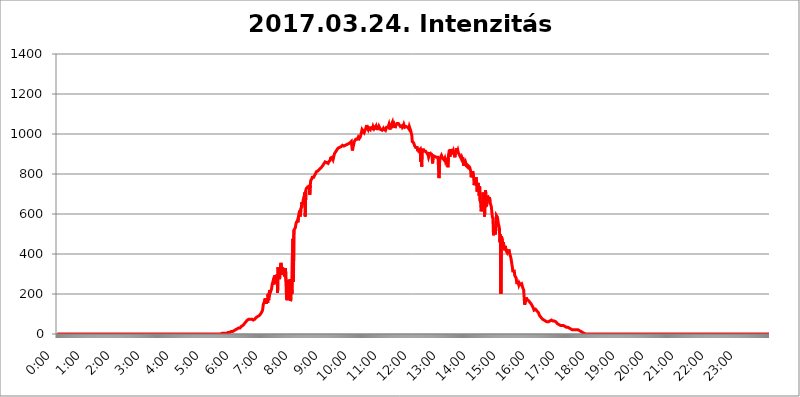
| Category | 2017.03.24. Intenzitás [W/m^2] |
|---|---|
| 0.0 | 0 |
| 0.0006944444444444445 | 0 |
| 0.001388888888888889 | 0 |
| 0.0020833333333333333 | 0 |
| 0.002777777777777778 | 0 |
| 0.003472222222222222 | 0 |
| 0.004166666666666667 | 0 |
| 0.004861111111111111 | 0 |
| 0.005555555555555556 | 0 |
| 0.0062499999999999995 | 0 |
| 0.006944444444444444 | 0 |
| 0.007638888888888889 | 0 |
| 0.008333333333333333 | 0 |
| 0.009027777777777779 | 0 |
| 0.009722222222222222 | 0 |
| 0.010416666666666666 | 0 |
| 0.011111111111111112 | 0 |
| 0.011805555555555555 | 0 |
| 0.012499999999999999 | 0 |
| 0.013194444444444444 | 0 |
| 0.013888888888888888 | 0 |
| 0.014583333333333332 | 0 |
| 0.015277777777777777 | 0 |
| 0.015972222222222224 | 0 |
| 0.016666666666666666 | 0 |
| 0.017361111111111112 | 0 |
| 0.018055555555555557 | 0 |
| 0.01875 | 0 |
| 0.019444444444444445 | 0 |
| 0.02013888888888889 | 0 |
| 0.020833333333333332 | 0 |
| 0.02152777777777778 | 0 |
| 0.022222222222222223 | 0 |
| 0.02291666666666667 | 0 |
| 0.02361111111111111 | 0 |
| 0.024305555555555556 | 0 |
| 0.024999999999999998 | 0 |
| 0.025694444444444447 | 0 |
| 0.02638888888888889 | 0 |
| 0.027083333333333334 | 0 |
| 0.027777777777777776 | 0 |
| 0.02847222222222222 | 0 |
| 0.029166666666666664 | 0 |
| 0.029861111111111113 | 0 |
| 0.030555555555555555 | 0 |
| 0.03125 | 0 |
| 0.03194444444444445 | 0 |
| 0.03263888888888889 | 0 |
| 0.03333333333333333 | 0 |
| 0.034027777777777775 | 0 |
| 0.034722222222222224 | 0 |
| 0.035416666666666666 | 0 |
| 0.036111111111111115 | 0 |
| 0.03680555555555556 | 0 |
| 0.0375 | 0 |
| 0.03819444444444444 | 0 |
| 0.03888888888888889 | 0 |
| 0.03958333333333333 | 0 |
| 0.04027777777777778 | 0 |
| 0.04097222222222222 | 0 |
| 0.041666666666666664 | 0 |
| 0.042361111111111106 | 0 |
| 0.04305555555555556 | 0 |
| 0.043750000000000004 | 0 |
| 0.044444444444444446 | 0 |
| 0.04513888888888889 | 0 |
| 0.04583333333333334 | 0 |
| 0.04652777777777778 | 0 |
| 0.04722222222222222 | 0 |
| 0.04791666666666666 | 0 |
| 0.04861111111111111 | 0 |
| 0.049305555555555554 | 0 |
| 0.049999999999999996 | 0 |
| 0.05069444444444445 | 0 |
| 0.051388888888888894 | 0 |
| 0.052083333333333336 | 0 |
| 0.05277777777777778 | 0 |
| 0.05347222222222222 | 0 |
| 0.05416666666666667 | 0 |
| 0.05486111111111111 | 0 |
| 0.05555555555555555 | 0 |
| 0.05625 | 0 |
| 0.05694444444444444 | 0 |
| 0.057638888888888885 | 0 |
| 0.05833333333333333 | 0 |
| 0.05902777777777778 | 0 |
| 0.059722222222222225 | 0 |
| 0.06041666666666667 | 0 |
| 0.061111111111111116 | 0 |
| 0.06180555555555556 | 0 |
| 0.0625 | 0 |
| 0.06319444444444444 | 0 |
| 0.06388888888888888 | 0 |
| 0.06458333333333334 | 0 |
| 0.06527777777777778 | 0 |
| 0.06597222222222222 | 0 |
| 0.06666666666666667 | 0 |
| 0.06736111111111111 | 0 |
| 0.06805555555555555 | 0 |
| 0.06874999999999999 | 0 |
| 0.06944444444444443 | 0 |
| 0.07013888888888889 | 0 |
| 0.07083333333333333 | 0 |
| 0.07152777777777779 | 0 |
| 0.07222222222222223 | 0 |
| 0.07291666666666667 | 0 |
| 0.07361111111111111 | 0 |
| 0.07430555555555556 | 0 |
| 0.075 | 0 |
| 0.07569444444444444 | 0 |
| 0.0763888888888889 | 0 |
| 0.07708333333333334 | 0 |
| 0.07777777777777778 | 0 |
| 0.07847222222222222 | 0 |
| 0.07916666666666666 | 0 |
| 0.0798611111111111 | 0 |
| 0.08055555555555556 | 0 |
| 0.08125 | 0 |
| 0.08194444444444444 | 0 |
| 0.08263888888888889 | 0 |
| 0.08333333333333333 | 0 |
| 0.08402777777777777 | 0 |
| 0.08472222222222221 | 0 |
| 0.08541666666666665 | 0 |
| 0.08611111111111112 | 0 |
| 0.08680555555555557 | 0 |
| 0.08750000000000001 | 0 |
| 0.08819444444444445 | 0 |
| 0.08888888888888889 | 0 |
| 0.08958333333333333 | 0 |
| 0.09027777777777778 | 0 |
| 0.09097222222222222 | 0 |
| 0.09166666666666667 | 0 |
| 0.09236111111111112 | 0 |
| 0.09305555555555556 | 0 |
| 0.09375 | 0 |
| 0.09444444444444444 | 0 |
| 0.09513888888888888 | 0 |
| 0.09583333333333333 | 0 |
| 0.09652777777777777 | 0 |
| 0.09722222222222222 | 0 |
| 0.09791666666666667 | 0 |
| 0.09861111111111111 | 0 |
| 0.09930555555555555 | 0 |
| 0.09999999999999999 | 0 |
| 0.10069444444444443 | 0 |
| 0.1013888888888889 | 0 |
| 0.10208333333333335 | 0 |
| 0.10277777777777779 | 0 |
| 0.10347222222222223 | 0 |
| 0.10416666666666667 | 0 |
| 0.10486111111111111 | 0 |
| 0.10555555555555556 | 0 |
| 0.10625 | 0 |
| 0.10694444444444444 | 0 |
| 0.1076388888888889 | 0 |
| 0.10833333333333334 | 0 |
| 0.10902777777777778 | 0 |
| 0.10972222222222222 | 0 |
| 0.1111111111111111 | 0 |
| 0.11180555555555556 | 0 |
| 0.11180555555555556 | 0 |
| 0.1125 | 0 |
| 0.11319444444444444 | 0 |
| 0.11388888888888889 | 0 |
| 0.11458333333333333 | 0 |
| 0.11527777777777777 | 0 |
| 0.11597222222222221 | 0 |
| 0.11666666666666665 | 0 |
| 0.1173611111111111 | 0 |
| 0.11805555555555557 | 0 |
| 0.11944444444444445 | 0 |
| 0.12013888888888889 | 0 |
| 0.12083333333333333 | 0 |
| 0.12152777777777778 | 0 |
| 0.12222222222222223 | 0 |
| 0.12291666666666667 | 0 |
| 0.12291666666666667 | 0 |
| 0.12361111111111112 | 0 |
| 0.12430555555555556 | 0 |
| 0.125 | 0 |
| 0.12569444444444444 | 0 |
| 0.12638888888888888 | 0 |
| 0.12708333333333333 | 0 |
| 0.16875 | 0 |
| 0.12847222222222224 | 0 |
| 0.12916666666666668 | 0 |
| 0.12986111111111112 | 0 |
| 0.13055555555555556 | 0 |
| 0.13125 | 0 |
| 0.13194444444444445 | 0 |
| 0.1326388888888889 | 0 |
| 0.13333333333333333 | 0 |
| 0.13402777777777777 | 0 |
| 0.13402777777777777 | 0 |
| 0.13472222222222222 | 0 |
| 0.13541666666666666 | 0 |
| 0.1361111111111111 | 0 |
| 0.13749999999999998 | 0 |
| 0.13819444444444443 | 0 |
| 0.1388888888888889 | 0 |
| 0.13958333333333334 | 0 |
| 0.14027777777777778 | 0 |
| 0.14097222222222222 | 0 |
| 0.14166666666666666 | 0 |
| 0.1423611111111111 | 0 |
| 0.14305555555555557 | 0 |
| 0.14375000000000002 | 0 |
| 0.14444444444444446 | 0 |
| 0.1451388888888889 | 0 |
| 0.1451388888888889 | 0 |
| 0.14652777777777778 | 0 |
| 0.14722222222222223 | 0 |
| 0.14791666666666667 | 0 |
| 0.1486111111111111 | 0 |
| 0.14930555555555555 | 0 |
| 0.15 | 0 |
| 0.15069444444444444 | 0 |
| 0.15138888888888888 | 0 |
| 0.15208333333333332 | 0 |
| 0.15277777777777776 | 0 |
| 0.15347222222222223 | 0 |
| 0.15416666666666667 | 0 |
| 0.15486111111111112 | 0 |
| 0.15555555555555556 | 0 |
| 0.15625 | 0 |
| 0.15694444444444444 | 0 |
| 0.15763888888888888 | 0 |
| 0.15833333333333333 | 0 |
| 0.15902777777777777 | 0 |
| 0.15972222222222224 | 0 |
| 0.16041666666666668 | 0 |
| 0.16111111111111112 | 0 |
| 0.16180555555555556 | 0 |
| 0.1625 | 0 |
| 0.16319444444444445 | 0 |
| 0.1638888888888889 | 0 |
| 0.16458333333333333 | 0 |
| 0.16527777777777777 | 0 |
| 0.16597222222222222 | 0 |
| 0.16666666666666666 | 0 |
| 0.1673611111111111 | 0 |
| 0.16805555555555554 | 0 |
| 0.16874999999999998 | 0 |
| 0.16944444444444443 | 0 |
| 0.17013888888888887 | 0 |
| 0.1708333333333333 | 0 |
| 0.17152777777777775 | 0 |
| 0.17222222222222225 | 0 |
| 0.1729166666666667 | 0 |
| 0.17361111111111113 | 0 |
| 0.17430555555555557 | 0 |
| 0.17500000000000002 | 0 |
| 0.17569444444444446 | 0 |
| 0.1763888888888889 | 0 |
| 0.17708333333333334 | 0 |
| 0.17777777777777778 | 0 |
| 0.17847222222222223 | 0 |
| 0.17916666666666667 | 0 |
| 0.1798611111111111 | 0 |
| 0.18055555555555555 | 0 |
| 0.18125 | 0 |
| 0.18194444444444444 | 0 |
| 0.1826388888888889 | 0 |
| 0.18333333333333335 | 0 |
| 0.1840277777777778 | 0 |
| 0.18472222222222223 | 0 |
| 0.18541666666666667 | 0 |
| 0.18611111111111112 | 0 |
| 0.18680555555555556 | 0 |
| 0.1875 | 0 |
| 0.18819444444444444 | 0 |
| 0.18888888888888888 | 0 |
| 0.18958333333333333 | 0 |
| 0.19027777777777777 | 0 |
| 0.1909722222222222 | 0 |
| 0.19166666666666665 | 0 |
| 0.19236111111111112 | 0 |
| 0.19305555555555554 | 0 |
| 0.19375 | 0 |
| 0.19444444444444445 | 0 |
| 0.1951388888888889 | 0 |
| 0.19583333333333333 | 0 |
| 0.19652777777777777 | 0 |
| 0.19722222222222222 | 0 |
| 0.19791666666666666 | 0 |
| 0.1986111111111111 | 0 |
| 0.19930555555555554 | 0 |
| 0.19999999999999998 | 0 |
| 0.20069444444444443 | 0 |
| 0.20138888888888887 | 0 |
| 0.2020833333333333 | 0 |
| 0.2027777777777778 | 0 |
| 0.2034722222222222 | 0 |
| 0.2041666666666667 | 0 |
| 0.20486111111111113 | 0 |
| 0.20555555555555557 | 0 |
| 0.20625000000000002 | 0 |
| 0.20694444444444446 | 0 |
| 0.2076388888888889 | 0 |
| 0.20833333333333334 | 0 |
| 0.20902777777777778 | 0 |
| 0.20972222222222223 | 0 |
| 0.21041666666666667 | 0 |
| 0.2111111111111111 | 0 |
| 0.21180555555555555 | 0 |
| 0.2125 | 0 |
| 0.21319444444444444 | 0 |
| 0.2138888888888889 | 0 |
| 0.21458333333333335 | 0 |
| 0.2152777777777778 | 0 |
| 0.21597222222222223 | 0 |
| 0.21666666666666667 | 0 |
| 0.21736111111111112 | 0 |
| 0.21805555555555556 | 0 |
| 0.21875 | 0 |
| 0.21944444444444444 | 0 |
| 0.22013888888888888 | 0 |
| 0.22083333333333333 | 0 |
| 0.22152777777777777 | 0 |
| 0.2222222222222222 | 0 |
| 0.22291666666666665 | 0 |
| 0.2236111111111111 | 0 |
| 0.22430555555555556 | 0 |
| 0.225 | 0 |
| 0.22569444444444445 | 0 |
| 0.2263888888888889 | 0 |
| 0.22708333333333333 | 0 |
| 0.22777777777777777 | 0 |
| 0.22847222222222222 | 0 |
| 0.22916666666666666 | 0 |
| 0.2298611111111111 | 3.525 |
| 0.23055555555555554 | 3.525 |
| 0.23124999999999998 | 3.525 |
| 0.23194444444444443 | 3.525 |
| 0.23263888888888887 | 3.525 |
| 0.2333333333333333 | 3.525 |
| 0.2340277777777778 | 3.525 |
| 0.2347222222222222 | 3.525 |
| 0.2354166666666667 | 3.525 |
| 0.23611111111111113 | 3.525 |
| 0.23680555555555557 | 3.525 |
| 0.23750000000000002 | 3.525 |
| 0.23819444444444446 | 3.525 |
| 0.2388888888888889 | 3.525 |
| 0.23958333333333334 | 7.887 |
| 0.24027777777777778 | 7.887 |
| 0.24097222222222223 | 7.887 |
| 0.24166666666666667 | 7.887 |
| 0.2423611111111111 | 7.887 |
| 0.24305555555555555 | 12.257 |
| 0.24375 | 12.257 |
| 0.24444444444444446 | 12.257 |
| 0.24513888888888888 | 12.257 |
| 0.24583333333333335 | 12.257 |
| 0.2465277777777778 | 16.636 |
| 0.24722222222222223 | 16.636 |
| 0.24791666666666667 | 16.636 |
| 0.24861111111111112 | 21.024 |
| 0.24930555555555556 | 21.024 |
| 0.25 | 21.024 |
| 0.25069444444444444 | 21.024 |
| 0.2513888888888889 | 21.024 |
| 0.2520833333333333 | 25.419 |
| 0.25277777777777777 | 25.419 |
| 0.2534722222222222 | 29.823 |
| 0.25416666666666665 | 29.823 |
| 0.2548611111111111 | 29.823 |
| 0.2555555555555556 | 29.823 |
| 0.25625000000000003 | 29.823 |
| 0.2569444444444445 | 34.234 |
| 0.2576388888888889 | 34.234 |
| 0.25833333333333336 | 38.653 |
| 0.2590277777777778 | 38.653 |
| 0.25972222222222224 | 43.079 |
| 0.2604166666666667 | 43.079 |
| 0.2611111111111111 | 47.511 |
| 0.26180555555555557 | 47.511 |
| 0.2625 | 51.951 |
| 0.26319444444444445 | 56.398 |
| 0.2638888888888889 | 56.398 |
| 0.26458333333333334 | 60.85 |
| 0.2652777777777778 | 65.31 |
| 0.2659722222222222 | 65.31 |
| 0.26666666666666666 | 69.775 |
| 0.2673611111111111 | 69.775 |
| 0.26805555555555555 | 69.775 |
| 0.26875 | 74.246 |
| 0.26944444444444443 | 74.246 |
| 0.2701388888888889 | 74.246 |
| 0.2708333333333333 | 74.246 |
| 0.27152777777777776 | 74.246 |
| 0.2722222222222222 | 74.246 |
| 0.27291666666666664 | 74.246 |
| 0.2736111111111111 | 74.246 |
| 0.2743055555555555 | 69.775 |
| 0.27499999999999997 | 69.775 |
| 0.27569444444444446 | 69.775 |
| 0.27638888888888885 | 69.775 |
| 0.27708333333333335 | 74.246 |
| 0.2777777777777778 | 74.246 |
| 0.27847222222222223 | 78.722 |
| 0.2791666666666667 | 83.205 |
| 0.2798611111111111 | 83.205 |
| 0.28055555555555556 | 83.205 |
| 0.28125 | 87.692 |
| 0.28194444444444444 | 92.184 |
| 0.2826388888888889 | 92.184 |
| 0.2833333333333333 | 92.184 |
| 0.28402777777777777 | 96.682 |
| 0.2847222222222222 | 96.682 |
| 0.28541666666666665 | 101.184 |
| 0.28611111111111115 | 105.69 |
| 0.28680555555555554 | 105.69 |
| 0.28750000000000003 | 114.716 |
| 0.2881944444444445 | 123.758 |
| 0.2888888888888889 | 146.423 |
| 0.28958333333333336 | 150.964 |
| 0.2902777777777778 | 160.056 |
| 0.29097222222222224 | 169.156 |
| 0.2916666666666667 | 178.264 |
| 0.2923611111111111 | 160.056 |
| 0.29305555555555557 | 150.964 |
| 0.29375 | 146.423 |
| 0.29444444444444445 | 173.709 |
| 0.2951388888888889 | 155.509 |
| 0.29583333333333334 | 201.058 |
| 0.2965277777777778 | 169.156 |
| 0.2972222222222222 | 201.058 |
| 0.29791666666666666 | 219.309 |
| 0.2986111111111111 | 205.62 |
| 0.29930555555555555 | 210.182 |
| 0.3 | 219.309 |
| 0.30069444444444443 | 228.436 |
| 0.3013888888888889 | 246.689 |
| 0.3020833333333333 | 255.813 |
| 0.30277777777777776 | 246.689 |
| 0.3034722222222222 | 269.49 |
| 0.30416666666666664 | 283.156 |
| 0.3048611111111111 | 292.259 |
| 0.3055555555555555 | 264.932 |
| 0.30624999999999997 | 264.932 |
| 0.3069444444444444 | 292.259 |
| 0.3076388888888889 | 251.251 |
| 0.30833333333333335 | 296.808 |
| 0.3090277777777778 | 205.62 |
| 0.30972222222222223 | 333.113 |
| 0.3104166666666667 | 324.052 |
| 0.3111111111111111 | 283.156 |
| 0.31180555555555556 | 274.047 |
| 0.3125 | 314.98 |
| 0.31319444444444444 | 346.682 |
| 0.3138888888888889 | 355.712 |
| 0.3145833333333333 | 328.584 |
| 0.31527777777777777 | 296.808 |
| 0.3159722222222222 | 333.113 |
| 0.31666666666666665 | 324.052 |
| 0.31736111111111115 | 324.052 |
| 0.31805555555555554 | 319.517 |
| 0.31875000000000003 | 287.709 |
| 0.3194444444444445 | 310.44 |
| 0.3201388888888889 | 328.584 |
| 0.32083333333333336 | 260.373 |
| 0.3215277777777778 | 182.82 |
| 0.32222222222222224 | 169.156 |
| 0.3229166666666667 | 173.709 |
| 0.3236111111111111 | 269.49 |
| 0.32430555555555557 | 228.436 |
| 0.325 | 169.156 |
| 0.32569444444444445 | 178.264 |
| 0.3263888888888889 | 274.047 |
| 0.32708333333333334 | 164.605 |
| 0.3277777777777778 | 173.709 |
| 0.3284722222222222 | 233 |
| 0.32916666666666666 | 201.058 |
| 0.3298611111111111 | 400.638 |
| 0.33055555555555555 | 475.972 |
| 0.33125 | 260.373 |
| 0.33194444444444443 | 519.555 |
| 0.3326388888888889 | 523.88 |
| 0.3333333333333333 | 519.555 |
| 0.3340277777777778 | 532.513 |
| 0.3347222222222222 | 549.704 |
| 0.3354166666666667 | 558.261 |
| 0.3361111111111111 | 562.53 |
| 0.3368055555555556 | 566.793 |
| 0.33749999999999997 | 558.261 |
| 0.33819444444444446 | 583.779 |
| 0.33888888888888885 | 600.661 |
| 0.33958333333333335 | 596.45 |
| 0.34027777777777773 | 617.436 |
| 0.34097222222222223 | 588.009 |
| 0.3416666666666666 | 625.784 |
| 0.3423611111111111 | 634.105 |
| 0.3430555555555555 | 658.909 |
| 0.34375 | 650.667 |
| 0.3444444444444445 | 658.909 |
| 0.3451388888888889 | 658.909 |
| 0.3458333333333334 | 683.473 |
| 0.34652777777777777 | 691.608 |
| 0.34722222222222227 | 707.8 |
| 0.34791666666666665 | 588.009 |
| 0.34861111111111115 | 715.858 |
| 0.34930555555555554 | 727.896 |
| 0.35000000000000003 | 727.896 |
| 0.3506944444444444 | 731.896 |
| 0.3513888888888889 | 735.89 |
| 0.3520833333333333 | 735.89 |
| 0.3527777777777778 | 735.89 |
| 0.3534722222222222 | 739.877 |
| 0.3541666666666667 | 695.666 |
| 0.3548611111111111 | 743.859 |
| 0.35555555555555557 | 767.62 |
| 0.35625 | 767.62 |
| 0.35694444444444445 | 775.492 |
| 0.3576388888888889 | 783.342 |
| 0.35833333333333334 | 787.258 |
| 0.3590277777777778 | 783.342 |
| 0.3597222222222222 | 783.342 |
| 0.36041666666666666 | 787.258 |
| 0.3611111111111111 | 795.074 |
| 0.36180555555555555 | 798.974 |
| 0.3625 | 802.868 |
| 0.36319444444444443 | 810.641 |
| 0.3638888888888889 | 814.519 |
| 0.3645833333333333 | 814.519 |
| 0.3652777777777778 | 814.519 |
| 0.3659722222222222 | 814.519 |
| 0.3666666666666667 | 818.392 |
| 0.3673611111111111 | 822.26 |
| 0.3680555555555556 | 826.123 |
| 0.36874999999999997 | 826.123 |
| 0.36944444444444446 | 829.981 |
| 0.37013888888888885 | 833.834 |
| 0.37083333333333335 | 833.834 |
| 0.37152777777777773 | 837.682 |
| 0.37222222222222223 | 841.526 |
| 0.3729166666666666 | 845.365 |
| 0.3736111111111111 | 849.199 |
| 0.3743055555555555 | 853.029 |
| 0.375 | 856.855 |
| 0.3756944444444445 | 860.676 |
| 0.3763888888888889 | 860.676 |
| 0.3770833333333334 | 860.676 |
| 0.37777777777777777 | 856.855 |
| 0.37847222222222227 | 860.676 |
| 0.37916666666666665 | 856.855 |
| 0.37986111111111115 | 853.029 |
| 0.38055555555555554 | 860.676 |
| 0.38125000000000003 | 864.493 |
| 0.3819444444444444 | 860.676 |
| 0.3826388888888889 | 868.305 |
| 0.3833333333333333 | 879.719 |
| 0.3840277777777778 | 883.516 |
| 0.3847222222222222 | 879.719 |
| 0.3854166666666667 | 883.516 |
| 0.3861111111111111 | 879.719 |
| 0.38680555555555557 | 872.114 |
| 0.3875 | 875.918 |
| 0.38819444444444445 | 872.114 |
| 0.3888888888888889 | 902.447 |
| 0.38958333333333334 | 898.668 |
| 0.3902777777777778 | 909.996 |
| 0.3909722222222222 | 913.766 |
| 0.39166666666666666 | 917.534 |
| 0.3923611111111111 | 921.298 |
| 0.39305555555555555 | 917.534 |
| 0.39375 | 928.819 |
| 0.39444444444444443 | 932.576 |
| 0.3951388888888889 | 932.576 |
| 0.3958333333333333 | 932.576 |
| 0.3965277777777778 | 932.576 |
| 0.3972222222222222 | 932.576 |
| 0.3979166666666667 | 936.33 |
| 0.3986111111111111 | 940.082 |
| 0.3993055555555556 | 940.082 |
| 0.39999999999999997 | 943.832 |
| 0.40069444444444446 | 943.832 |
| 0.40138888888888885 | 943.832 |
| 0.40208333333333335 | 940.082 |
| 0.40277777777777773 | 943.832 |
| 0.40347222222222223 | 943.832 |
| 0.4041666666666666 | 943.832 |
| 0.4048611111111111 | 943.832 |
| 0.4055555555555555 | 943.832 |
| 0.40625 | 947.58 |
| 0.4069444444444445 | 947.58 |
| 0.4076388888888889 | 947.58 |
| 0.4083333333333334 | 951.327 |
| 0.40902777777777777 | 955.071 |
| 0.40972222222222227 | 955.071 |
| 0.41041666666666665 | 955.071 |
| 0.41111111111111115 | 958.814 |
| 0.41180555555555554 | 958.814 |
| 0.41250000000000003 | 962.555 |
| 0.4131944444444444 | 962.555 |
| 0.4138888888888889 | 917.534 |
| 0.4145833333333333 | 928.819 |
| 0.4152777777777778 | 940.082 |
| 0.4159722222222222 | 940.082 |
| 0.4166666666666667 | 962.555 |
| 0.4173611111111111 | 962.555 |
| 0.41805555555555557 | 966.295 |
| 0.41875 | 973.772 |
| 0.41944444444444445 | 973.772 |
| 0.4201388888888889 | 970.034 |
| 0.42083333333333334 | 973.772 |
| 0.4215277777777778 | 977.508 |
| 0.4222222222222222 | 984.98 |
| 0.42291666666666666 | 988.714 |
| 0.4236111111111111 | 977.508 |
| 0.42430555555555555 | 981.244 |
| 0.425 | 984.98 |
| 0.42569444444444443 | 984.98 |
| 0.4263888888888889 | 1003.65 |
| 0.4270833333333333 | 1014.852 |
| 0.4277777777777778 | 1007.383 |
| 0.4284722222222222 | 999.916 |
| 0.4291666666666667 | 1014.852 |
| 0.4298611111111111 | 1011.118 |
| 0.4305555555555556 | 1007.383 |
| 0.43124999999999997 | 1014.852 |
| 0.43194444444444446 | 1014.852 |
| 0.43263888888888885 | 1026.06 |
| 0.43333333333333335 | 1022.323 |
| 0.43402777777777773 | 1044.762 |
| 0.43472222222222223 | 1033.537 |
| 0.4354166666666666 | 1037.277 |
| 0.4361111111111111 | 1022.323 |
| 0.4368055555555555 | 1029.798 |
| 0.4375 | 1026.06 |
| 0.4381944444444445 | 1026.06 |
| 0.4388888888888889 | 1022.323 |
| 0.4395833333333334 | 1037.277 |
| 0.44027777777777777 | 1029.798 |
| 0.44097222222222227 | 1029.798 |
| 0.44166666666666665 | 1033.537 |
| 0.44236111111111115 | 1026.06 |
| 0.44305555555555554 | 1037.277 |
| 0.44375000000000003 | 1033.537 |
| 0.4444444444444444 | 1026.06 |
| 0.4451388888888889 | 1029.798 |
| 0.4458333333333333 | 1029.798 |
| 0.4465277777777778 | 1037.277 |
| 0.4472222222222222 | 1022.323 |
| 0.4479166666666667 | 1033.537 |
| 0.4486111111111111 | 1026.06 |
| 0.44930555555555557 | 1022.323 |
| 0.45 | 1022.323 |
| 0.45069444444444445 | 1026.06 |
| 0.4513888888888889 | 1037.277 |
| 0.45208333333333334 | 1037.277 |
| 0.4527777777777778 | 1033.537 |
| 0.4534722222222222 | 1022.323 |
| 0.45416666666666666 | 1022.323 |
| 0.4548611111111111 | 1022.323 |
| 0.45555555555555555 | 1018.587 |
| 0.45625 | 1018.587 |
| 0.45694444444444443 | 1026.06 |
| 0.4576388888888889 | 1014.852 |
| 0.4583333333333333 | 1026.06 |
| 0.4590277777777778 | 1029.798 |
| 0.4597222222222222 | 1022.323 |
| 0.4604166666666667 | 1018.587 |
| 0.4611111111111111 | 1022.323 |
| 0.4618055555555556 | 1033.537 |
| 0.46249999999999997 | 1037.277 |
| 0.46319444444444446 | 1033.537 |
| 0.46388888888888885 | 1033.537 |
| 0.46458333333333335 | 1037.277 |
| 0.46527777777777773 | 1048.508 |
| 0.46597222222222223 | 1037.277 |
| 0.4666666666666666 | 1022.323 |
| 0.4673611111111111 | 1041.019 |
| 0.4680555555555555 | 1044.762 |
| 0.46875 | 1048.508 |
| 0.4694444444444445 | 1048.508 |
| 0.4701388888888889 | 1059.756 |
| 0.4708333333333334 | 1044.762 |
| 0.47152777777777777 | 1044.762 |
| 0.47222222222222227 | 1052.255 |
| 0.47291666666666665 | 1044.762 |
| 0.47361111111111115 | 1029.798 |
| 0.47430555555555554 | 1037.277 |
| 0.47500000000000003 | 1041.019 |
| 0.4756944444444444 | 1041.019 |
| 0.4763888888888889 | 1052.255 |
| 0.4770833333333333 | 1052.255 |
| 0.4777777777777778 | 1052.255 |
| 0.4784722222222222 | 1052.255 |
| 0.4791666666666667 | 1048.508 |
| 0.4798611111111111 | 1044.762 |
| 0.48055555555555557 | 1048.508 |
| 0.48125 | 1037.277 |
| 0.48194444444444445 | 1041.019 |
| 0.4826388888888889 | 1041.019 |
| 0.48333333333333334 | 1041.019 |
| 0.4840277777777778 | 1033.537 |
| 0.4847222222222222 | 1037.277 |
| 0.48541666666666666 | 1041.019 |
| 0.4861111111111111 | 1048.508 |
| 0.48680555555555555 | 1044.762 |
| 0.4875 | 1033.537 |
| 0.48819444444444443 | 1037.277 |
| 0.4888888888888889 | 1037.277 |
| 0.4895833333333333 | 1037.277 |
| 0.4902777777777778 | 1033.537 |
| 0.4909722222222222 | 1033.537 |
| 0.4916666666666667 | 1033.537 |
| 0.4923611111111111 | 1037.277 |
| 0.4930555555555556 | 1026.06 |
| 0.49374999999999997 | 1037.277 |
| 0.49444444444444446 | 1029.798 |
| 0.49513888888888885 | 1026.06 |
| 0.49583333333333335 | 1014.852 |
| 0.49652777777777773 | 1003.65 |
| 0.49722222222222223 | 996.182 |
| 0.4979166666666666 | 962.555 |
| 0.4986111111111111 | 966.295 |
| 0.4993055555555555 | 966.295 |
| 0.5 | 955.071 |
| 0.5006944444444444 | 951.327 |
| 0.5013888888888889 | 940.082 |
| 0.5020833333333333 | 940.082 |
| 0.5027777777777778 | 932.576 |
| 0.5034722222222222 | 928.819 |
| 0.5041666666666667 | 932.576 |
| 0.5048611111111111 | 932.576 |
| 0.5055555555555555 | 913.766 |
| 0.50625 | 928.819 |
| 0.5069444444444444 | 917.534 |
| 0.5076388888888889 | 917.534 |
| 0.5083333333333333 | 921.298 |
| 0.5090277777777777 | 925.06 |
| 0.5097222222222222 | 860.676 |
| 0.5104166666666666 | 913.766 |
| 0.5111111111111112 | 837.682 |
| 0.5118055555555555 | 921.298 |
| 0.5125000000000001 | 921.298 |
| 0.5131944444444444 | 925.06 |
| 0.513888888888889 | 921.298 |
| 0.5145833333333333 | 913.766 |
| 0.5152777777777778 | 913.766 |
| 0.5159722222222222 | 913.766 |
| 0.5166666666666667 | 913.766 |
| 0.517361111111111 | 909.996 |
| 0.5180555555555556 | 909.996 |
| 0.5187499999999999 | 902.447 |
| 0.5194444444444445 | 898.668 |
| 0.5201388888888888 | 894.885 |
| 0.5208333333333334 | 883.516 |
| 0.5215277777777778 | 891.099 |
| 0.5222222222222223 | 909.996 |
| 0.5229166666666667 | 902.447 |
| 0.5236111111111111 | 902.447 |
| 0.5243055555555556 | 902.447 |
| 0.525 | 898.668 |
| 0.5256944444444445 | 891.099 |
| 0.5263888888888889 | 853.029 |
| 0.5270833333333333 | 879.719 |
| 0.5277777777777778 | 891.099 |
| 0.5284722222222222 | 894.885 |
| 0.5291666666666667 | 891.099 |
| 0.5298611111111111 | 887.309 |
| 0.5305555555555556 | 883.516 |
| 0.53125 | 883.516 |
| 0.5319444444444444 | 883.516 |
| 0.5326388888888889 | 883.516 |
| 0.5333333333333333 | 887.309 |
| 0.5340277777777778 | 883.516 |
| 0.5347222222222222 | 887.309 |
| 0.5354166666666667 | 779.42 |
| 0.5361111111111111 | 853.029 |
| 0.5368055555555555 | 875.918 |
| 0.5375 | 872.114 |
| 0.5381944444444444 | 887.309 |
| 0.5388888888888889 | 875.918 |
| 0.5395833333333333 | 887.309 |
| 0.5402777777777777 | 883.516 |
| 0.5409722222222222 | 875.918 |
| 0.5416666666666666 | 879.719 |
| 0.5423611111111112 | 875.918 |
| 0.5430555555555555 | 868.305 |
| 0.5437500000000001 | 875.918 |
| 0.5444444444444444 | 864.493 |
| 0.545138888888889 | 872.114 |
| 0.5458333333333333 | 868.305 |
| 0.5465277777777778 | 875.918 |
| 0.5472222222222222 | 872.114 |
| 0.5479166666666667 | 833.834 |
| 0.548611111111111 | 891.099 |
| 0.5493055555555556 | 887.309 |
| 0.5499999999999999 | 921.298 |
| 0.5506944444444445 | 887.309 |
| 0.5513888888888888 | 902.447 |
| 0.5520833333333334 | 925.06 |
| 0.5527777777777778 | 928.819 |
| 0.5534722222222223 | 898.668 |
| 0.5541666666666667 | 906.223 |
| 0.5548611111111111 | 909.996 |
| 0.5555555555555556 | 917.534 |
| 0.55625 | 913.766 |
| 0.5569444444444445 | 913.766 |
| 0.5576388888888889 | 883.516 |
| 0.5583333333333333 | 902.447 |
| 0.5590277777777778 | 909.996 |
| 0.5597222222222222 | 906.223 |
| 0.5604166666666667 | 928.819 |
| 0.5611111111111111 | 909.996 |
| 0.5618055555555556 | 917.534 |
| 0.5625 | 906.223 |
| 0.5631944444444444 | 906.223 |
| 0.5638888888888889 | 902.447 |
| 0.5645833333333333 | 891.099 |
| 0.5652777777777778 | 887.309 |
| 0.5659722222222222 | 887.309 |
| 0.5666666666666667 | 875.918 |
| 0.5673611111111111 | 883.516 |
| 0.5680555555555555 | 875.918 |
| 0.56875 | 883.516 |
| 0.5694444444444444 | 856.855 |
| 0.5701388888888889 | 841.526 |
| 0.5708333333333333 | 856.855 |
| 0.5715277777777777 | 856.855 |
| 0.5722222222222222 | 864.493 |
| 0.5729166666666666 | 856.855 |
| 0.5736111111111112 | 841.526 |
| 0.5743055555555555 | 841.526 |
| 0.5750000000000001 | 837.682 |
| 0.5756944444444444 | 833.834 |
| 0.576388888888889 | 841.526 |
| 0.5770833333333333 | 837.682 |
| 0.5777777777777778 | 837.682 |
| 0.5784722222222222 | 833.834 |
| 0.5791666666666667 | 837.682 |
| 0.579861111111111 | 814.519 |
| 0.5805555555555556 | 783.342 |
| 0.5812499999999999 | 791.169 |
| 0.5819444444444445 | 806.757 |
| 0.5826388888888888 | 814.519 |
| 0.5833333333333334 | 810.641 |
| 0.5840277777777778 | 783.342 |
| 0.5847222222222223 | 743.859 |
| 0.5854166666666667 | 759.723 |
| 0.5861111111111111 | 767.62 |
| 0.5868055555555556 | 771.559 |
| 0.5875 | 783.342 |
| 0.5881944444444445 | 751.803 |
| 0.5888888888888889 | 711.832 |
| 0.5895833333333333 | 747.834 |
| 0.5902777777777778 | 755.766 |
| 0.5909722222222222 | 731.896 |
| 0.5916666666666667 | 691.608 |
| 0.5923611111111111 | 739.877 |
| 0.5930555555555556 | 667.123 |
| 0.59375 | 658.909 |
| 0.5944444444444444 | 613.252 |
| 0.5951388888888889 | 609.062 |
| 0.5958333333333333 | 629.948 |
| 0.5965277777777778 | 663.019 |
| 0.5972222222222222 | 707.8 |
| 0.5979166666666667 | 654.791 |
| 0.5986111111111111 | 679.395 |
| 0.5993055555555555 | 588.009 |
| 0.6 | 650.667 |
| 0.6006944444444444 | 719.877 |
| 0.6013888888888889 | 671.22 |
| 0.6020833333333333 | 638.256 |
| 0.6027777777777777 | 634.105 |
| 0.6034722222222222 | 691.608 |
| 0.6041666666666666 | 691.608 |
| 0.6048611111111112 | 695.666 |
| 0.6055555555555555 | 671.22 |
| 0.6062500000000001 | 683.473 |
| 0.6069444444444444 | 663.019 |
| 0.607638888888889 | 650.667 |
| 0.6083333333333333 | 642.4 |
| 0.6090277777777778 | 629.948 |
| 0.6097222222222222 | 600.661 |
| 0.6104166666666667 | 583.779 |
| 0.611111111111111 | 575.299 |
| 0.6118055555555556 | 493.475 |
| 0.6124999999999999 | 519.555 |
| 0.6131944444444445 | 519.555 |
| 0.6138888888888888 | 523.88 |
| 0.6145833333333334 | 497.836 |
| 0.6152777777777778 | 497.836 |
| 0.6159722222222223 | 592.233 |
| 0.6166666666666667 | 596.45 |
| 0.6173611111111111 | 583.779 |
| 0.6180555555555556 | 566.793 |
| 0.61875 | 549.704 |
| 0.6194444444444445 | 541.121 |
| 0.6201388888888889 | 528.2 |
| 0.6208333333333333 | 458.38 |
| 0.6215277777777778 | 497.836 |
| 0.6222222222222222 | 201.058 |
| 0.6229166666666667 | 489.108 |
| 0.6236111111111111 | 489.108 |
| 0.6243055555555556 | 467.187 |
| 0.625 | 449.551 |
| 0.6256944444444444 | 458.38 |
| 0.6263888888888889 | 436.27 |
| 0.6270833333333333 | 436.27 |
| 0.6277777777777778 | 418.492 |
| 0.6284722222222222 | 440.702 |
| 0.6291666666666667 | 422.943 |
| 0.6298611111111111 | 414.035 |
| 0.6305555555555555 | 418.492 |
| 0.63125 | 405.108 |
| 0.6319444444444444 | 409.574 |
| 0.6326388888888889 | 414.035 |
| 0.6333333333333333 | 422.943 |
| 0.6340277777777777 | 409.574 |
| 0.6347222222222222 | 400.638 |
| 0.6354166666666666 | 396.164 |
| 0.6361111111111112 | 382.715 |
| 0.6368055555555555 | 369.23 |
| 0.6375000000000001 | 351.198 |
| 0.6381944444444444 | 337.639 |
| 0.638888888888889 | 314.98 |
| 0.6395833333333333 | 310.44 |
| 0.6402777777777778 | 314.98 |
| 0.6409722222222222 | 314.98 |
| 0.6416666666666667 | 292.259 |
| 0.642361111111111 | 296.808 |
| 0.6430555555555556 | 287.709 |
| 0.6437499999999999 | 278.603 |
| 0.6444444444444445 | 255.813 |
| 0.6451388888888888 | 255.813 |
| 0.6458333333333334 | 251.251 |
| 0.6465277777777778 | 255.813 |
| 0.6472222222222223 | 246.689 |
| 0.6479166666666667 | 255.813 |
| 0.6486111111111111 | 251.251 |
| 0.6493055555555556 | 246.689 |
| 0.65 | 246.689 |
| 0.6506944444444445 | 242.127 |
| 0.6513888888888889 | 251.251 |
| 0.6520833333333333 | 242.127 |
| 0.6527777777777778 | 233 |
| 0.6534722222222222 | 233 |
| 0.6541666666666667 | 219.309 |
| 0.6548611111111111 | 214.746 |
| 0.6555555555555556 | 146.423 |
| 0.65625 | 141.884 |
| 0.6569444444444444 | 169.156 |
| 0.6576388888888889 | 182.82 |
| 0.6583333333333333 | 173.709 |
| 0.6590277777777778 | 169.156 |
| 0.6597222222222222 | 173.709 |
| 0.6604166666666667 | 169.156 |
| 0.6611111111111111 | 173.709 |
| 0.6618055555555555 | 173.709 |
| 0.6625 | 160.056 |
| 0.6631944444444444 | 160.056 |
| 0.6638888888888889 | 155.509 |
| 0.6645833333333333 | 150.964 |
| 0.6652777777777777 | 146.423 |
| 0.6659722222222222 | 141.884 |
| 0.6666666666666666 | 137.347 |
| 0.6673611111111111 | 132.814 |
| 0.6680555555555556 | 132.814 |
| 0.6687500000000001 | 119.235 |
| 0.6694444444444444 | 123.758 |
| 0.6701388888888888 | 123.758 |
| 0.6708333333333334 | 123.758 |
| 0.6715277777777778 | 123.758 |
| 0.6722222222222222 | 119.235 |
| 0.6729166666666666 | 114.716 |
| 0.6736111111111112 | 114.716 |
| 0.6743055555555556 | 114.716 |
| 0.6749999999999999 | 105.69 |
| 0.6756944444444444 | 101.184 |
| 0.6763888888888889 | 92.184 |
| 0.6770833333333334 | 92.184 |
| 0.6777777777777777 | 87.692 |
| 0.6784722222222223 | 83.205 |
| 0.6791666666666667 | 83.205 |
| 0.6798611111111111 | 78.722 |
| 0.6805555555555555 | 74.246 |
| 0.68125 | 74.246 |
| 0.6819444444444445 | 69.775 |
| 0.6826388888888889 | 69.775 |
| 0.6833333333333332 | 69.775 |
| 0.6840277777777778 | 65.31 |
| 0.6847222222222222 | 65.31 |
| 0.6854166666666667 | 65.31 |
| 0.686111111111111 | 65.31 |
| 0.6868055555555556 | 60.85 |
| 0.6875 | 60.85 |
| 0.6881944444444444 | 60.85 |
| 0.688888888888889 | 60.85 |
| 0.6895833333333333 | 65.31 |
| 0.6902777777777778 | 65.31 |
| 0.6909722222222222 | 65.31 |
| 0.6916666666666668 | 65.31 |
| 0.6923611111111111 | 69.775 |
| 0.6930555555555555 | 69.775 |
| 0.69375 | 69.775 |
| 0.6944444444444445 | 65.31 |
| 0.6951388888888889 | 65.31 |
| 0.6958333333333333 | 65.31 |
| 0.6965277777777777 | 65.31 |
| 0.6972222222222223 | 65.31 |
| 0.6979166666666666 | 65.31 |
| 0.6986111111111111 | 60.85 |
| 0.6993055555555556 | 60.85 |
| 0.7000000000000001 | 56.398 |
| 0.7006944444444444 | 56.398 |
| 0.7013888888888888 | 51.951 |
| 0.7020833333333334 | 47.511 |
| 0.7027777777777778 | 47.511 |
| 0.7034722222222222 | 47.511 |
| 0.7041666666666666 | 47.511 |
| 0.7048611111111112 | 43.079 |
| 0.7055555555555556 | 43.079 |
| 0.7062499999999999 | 43.079 |
| 0.7069444444444444 | 43.079 |
| 0.7076388888888889 | 43.079 |
| 0.7083333333333334 | 43.079 |
| 0.7090277777777777 | 43.079 |
| 0.7097222222222223 | 43.079 |
| 0.7104166666666667 | 38.653 |
| 0.7111111111111111 | 38.653 |
| 0.7118055555555555 | 38.653 |
| 0.7125 | 38.653 |
| 0.7131944444444445 | 38.653 |
| 0.7138888888888889 | 34.234 |
| 0.7145833333333332 | 34.234 |
| 0.7152777777777778 | 34.234 |
| 0.7159722222222222 | 34.234 |
| 0.7166666666666667 | 29.823 |
| 0.717361111111111 | 29.823 |
| 0.7180555555555556 | 29.823 |
| 0.71875 | 29.823 |
| 0.7194444444444444 | 25.419 |
| 0.720138888888889 | 25.419 |
| 0.7208333333333333 | 25.419 |
| 0.7215277777777778 | 25.419 |
| 0.7222222222222222 | 21.024 |
| 0.7229166666666668 | 21.024 |
| 0.7236111111111111 | 21.024 |
| 0.7243055555555555 | 21.024 |
| 0.725 | 21.024 |
| 0.7256944444444445 | 21.024 |
| 0.7263888888888889 | 21.024 |
| 0.7270833333333333 | 21.024 |
| 0.7277777777777777 | 21.024 |
| 0.7284722222222223 | 21.024 |
| 0.7291666666666666 | 21.024 |
| 0.7298611111111111 | 21.024 |
| 0.7305555555555556 | 21.024 |
| 0.7312500000000001 | 21.024 |
| 0.7319444444444444 | 16.636 |
| 0.7326388888888888 | 16.636 |
| 0.7333333333333334 | 16.636 |
| 0.7340277777777778 | 12.257 |
| 0.7347222222222222 | 12.257 |
| 0.7354166666666666 | 12.257 |
| 0.7361111111111112 | 12.257 |
| 0.7368055555555556 | 7.887 |
| 0.7374999999999999 | 7.887 |
| 0.7381944444444444 | 3.525 |
| 0.7388888888888889 | 3.525 |
| 0.7395833333333334 | 3.525 |
| 0.7402777777777777 | 3.525 |
| 0.7409722222222223 | 0 |
| 0.7416666666666667 | 3.525 |
| 0.7423611111111111 | 0 |
| 0.7430555555555555 | 0 |
| 0.74375 | 0 |
| 0.7444444444444445 | 0 |
| 0.7451388888888889 | 0 |
| 0.7458333333333332 | 0 |
| 0.7465277777777778 | 0 |
| 0.7472222222222222 | 0 |
| 0.7479166666666667 | 0 |
| 0.748611111111111 | 0 |
| 0.7493055555555556 | 0 |
| 0.75 | 0 |
| 0.7506944444444444 | 0 |
| 0.751388888888889 | 0 |
| 0.7520833333333333 | 0 |
| 0.7527777777777778 | 0 |
| 0.7534722222222222 | 0 |
| 0.7541666666666668 | 0 |
| 0.7548611111111111 | 0 |
| 0.7555555555555555 | 0 |
| 0.75625 | 0 |
| 0.7569444444444445 | 0 |
| 0.7576388888888889 | 0 |
| 0.7583333333333333 | 0 |
| 0.7590277777777777 | 0 |
| 0.7597222222222223 | 0 |
| 0.7604166666666666 | 0 |
| 0.7611111111111111 | 0 |
| 0.7618055555555556 | 0 |
| 0.7625000000000001 | 0 |
| 0.7631944444444444 | 0 |
| 0.7638888888888888 | 0 |
| 0.7645833333333334 | 0 |
| 0.7652777777777778 | 0 |
| 0.7659722222222222 | 0 |
| 0.7666666666666666 | 0 |
| 0.7673611111111112 | 0 |
| 0.7680555555555556 | 0 |
| 0.7687499999999999 | 0 |
| 0.7694444444444444 | 0 |
| 0.7701388888888889 | 0 |
| 0.7708333333333334 | 0 |
| 0.7715277777777777 | 0 |
| 0.7722222222222223 | 0 |
| 0.7729166666666667 | 0 |
| 0.7736111111111111 | 0 |
| 0.7743055555555555 | 0 |
| 0.775 | 0 |
| 0.7756944444444445 | 0 |
| 0.7763888888888889 | 0 |
| 0.7770833333333332 | 0 |
| 0.7777777777777778 | 0 |
| 0.7784722222222222 | 0 |
| 0.7791666666666667 | 0 |
| 0.779861111111111 | 0 |
| 0.7805555555555556 | 0 |
| 0.78125 | 0 |
| 0.7819444444444444 | 0 |
| 0.782638888888889 | 0 |
| 0.7833333333333333 | 0 |
| 0.7840277777777778 | 0 |
| 0.7847222222222222 | 0 |
| 0.7854166666666668 | 0 |
| 0.7861111111111111 | 0 |
| 0.7868055555555555 | 0 |
| 0.7875 | 0 |
| 0.7881944444444445 | 0 |
| 0.7888888888888889 | 0 |
| 0.7895833333333333 | 0 |
| 0.7902777777777777 | 0 |
| 0.7909722222222223 | 0 |
| 0.7916666666666666 | 0 |
| 0.7923611111111111 | 0 |
| 0.7930555555555556 | 0 |
| 0.7937500000000001 | 0 |
| 0.7944444444444444 | 0 |
| 0.7951388888888888 | 0 |
| 0.7958333333333334 | 0 |
| 0.7965277777777778 | 0 |
| 0.7972222222222222 | 0 |
| 0.7979166666666666 | 0 |
| 0.7986111111111112 | 0 |
| 0.7993055555555556 | 0 |
| 0.7999999999999999 | 0 |
| 0.8006944444444444 | 0 |
| 0.8013888888888889 | 0 |
| 0.8020833333333334 | 0 |
| 0.8027777777777777 | 0 |
| 0.8034722222222223 | 0 |
| 0.8041666666666667 | 0 |
| 0.8048611111111111 | 0 |
| 0.8055555555555555 | 0 |
| 0.80625 | 0 |
| 0.8069444444444445 | 0 |
| 0.8076388888888889 | 0 |
| 0.8083333333333332 | 0 |
| 0.8090277777777778 | 0 |
| 0.8097222222222222 | 0 |
| 0.8104166666666667 | 0 |
| 0.811111111111111 | 0 |
| 0.8118055555555556 | 0 |
| 0.8125 | 0 |
| 0.8131944444444444 | 0 |
| 0.813888888888889 | 0 |
| 0.8145833333333333 | 0 |
| 0.8152777777777778 | 0 |
| 0.8159722222222222 | 0 |
| 0.8166666666666668 | 0 |
| 0.8173611111111111 | 0 |
| 0.8180555555555555 | 0 |
| 0.81875 | 0 |
| 0.8194444444444445 | 0 |
| 0.8201388888888889 | 0 |
| 0.8208333333333333 | 0 |
| 0.8215277777777777 | 0 |
| 0.8222222222222223 | 0 |
| 0.8229166666666666 | 0 |
| 0.8236111111111111 | 0 |
| 0.8243055555555556 | 0 |
| 0.8250000000000001 | 0 |
| 0.8256944444444444 | 0 |
| 0.8263888888888888 | 0 |
| 0.8270833333333334 | 0 |
| 0.8277777777777778 | 0 |
| 0.8284722222222222 | 0 |
| 0.8291666666666666 | 0 |
| 0.8298611111111112 | 0 |
| 0.8305555555555556 | 0 |
| 0.8312499999999999 | 0 |
| 0.8319444444444444 | 0 |
| 0.8326388888888889 | 0 |
| 0.8333333333333334 | 0 |
| 0.8340277777777777 | 0 |
| 0.8347222222222223 | 0 |
| 0.8354166666666667 | 0 |
| 0.8361111111111111 | 0 |
| 0.8368055555555555 | 0 |
| 0.8375 | 0 |
| 0.8381944444444445 | 0 |
| 0.8388888888888889 | 0 |
| 0.8395833333333332 | 0 |
| 0.8402777777777778 | 0 |
| 0.8409722222222222 | 0 |
| 0.8416666666666667 | 0 |
| 0.842361111111111 | 0 |
| 0.8430555555555556 | 0 |
| 0.84375 | 0 |
| 0.8444444444444444 | 0 |
| 0.845138888888889 | 0 |
| 0.8458333333333333 | 0 |
| 0.8465277777777778 | 0 |
| 0.8472222222222222 | 0 |
| 0.8479166666666668 | 0 |
| 0.8486111111111111 | 0 |
| 0.8493055555555555 | 0 |
| 0.85 | 0 |
| 0.8506944444444445 | 0 |
| 0.8513888888888889 | 0 |
| 0.8520833333333333 | 0 |
| 0.8527777777777777 | 0 |
| 0.8534722222222223 | 0 |
| 0.8541666666666666 | 0 |
| 0.8548611111111111 | 0 |
| 0.8555555555555556 | 0 |
| 0.8562500000000001 | 0 |
| 0.8569444444444444 | 0 |
| 0.8576388888888888 | 0 |
| 0.8583333333333334 | 0 |
| 0.8590277777777778 | 0 |
| 0.8597222222222222 | 0 |
| 0.8604166666666666 | 0 |
| 0.8611111111111112 | 0 |
| 0.8618055555555556 | 0 |
| 0.8624999999999999 | 0 |
| 0.8631944444444444 | 0 |
| 0.8638888888888889 | 0 |
| 0.8645833333333334 | 0 |
| 0.8652777777777777 | 0 |
| 0.8659722222222223 | 0 |
| 0.8666666666666667 | 0 |
| 0.8673611111111111 | 0 |
| 0.8680555555555555 | 0 |
| 0.86875 | 0 |
| 0.8694444444444445 | 0 |
| 0.8701388888888889 | 0 |
| 0.8708333333333332 | 0 |
| 0.8715277777777778 | 0 |
| 0.8722222222222222 | 0 |
| 0.8729166666666667 | 0 |
| 0.873611111111111 | 0 |
| 0.8743055555555556 | 0 |
| 0.875 | 0 |
| 0.8756944444444444 | 0 |
| 0.876388888888889 | 0 |
| 0.8770833333333333 | 0 |
| 0.8777777777777778 | 0 |
| 0.8784722222222222 | 0 |
| 0.8791666666666668 | 0 |
| 0.8798611111111111 | 0 |
| 0.8805555555555555 | 0 |
| 0.88125 | 0 |
| 0.8819444444444445 | 0 |
| 0.8826388888888889 | 0 |
| 0.8833333333333333 | 0 |
| 0.8840277777777777 | 0 |
| 0.8847222222222223 | 0 |
| 0.8854166666666666 | 0 |
| 0.8861111111111111 | 0 |
| 0.8868055555555556 | 0 |
| 0.8875000000000001 | 0 |
| 0.8881944444444444 | 0 |
| 0.8888888888888888 | 0 |
| 0.8895833333333334 | 0 |
| 0.8902777777777778 | 0 |
| 0.8909722222222222 | 0 |
| 0.8916666666666666 | 0 |
| 0.8923611111111112 | 0 |
| 0.8930555555555556 | 0 |
| 0.8937499999999999 | 0 |
| 0.8944444444444444 | 0 |
| 0.8951388888888889 | 0 |
| 0.8958333333333334 | 0 |
| 0.8965277777777777 | 0 |
| 0.8972222222222223 | 0 |
| 0.8979166666666667 | 0 |
| 0.8986111111111111 | 0 |
| 0.8993055555555555 | 0 |
| 0.9 | 0 |
| 0.9006944444444445 | 0 |
| 0.9013888888888889 | 0 |
| 0.9020833333333332 | 0 |
| 0.9027777777777778 | 0 |
| 0.9034722222222222 | 0 |
| 0.9041666666666667 | 0 |
| 0.904861111111111 | 0 |
| 0.9055555555555556 | 0 |
| 0.90625 | 0 |
| 0.9069444444444444 | 0 |
| 0.907638888888889 | 0 |
| 0.9083333333333333 | 0 |
| 0.9090277777777778 | 0 |
| 0.9097222222222222 | 0 |
| 0.9104166666666668 | 0 |
| 0.9111111111111111 | 0 |
| 0.9118055555555555 | 0 |
| 0.9125 | 0 |
| 0.9131944444444445 | 0 |
| 0.9138888888888889 | 0 |
| 0.9145833333333333 | 0 |
| 0.9152777777777777 | 0 |
| 0.9159722222222223 | 0 |
| 0.9166666666666666 | 0 |
| 0.9173611111111111 | 0 |
| 0.9180555555555556 | 0 |
| 0.9187500000000001 | 0 |
| 0.9194444444444444 | 0 |
| 0.9201388888888888 | 0 |
| 0.9208333333333334 | 0 |
| 0.9215277777777778 | 0 |
| 0.9222222222222222 | 0 |
| 0.9229166666666666 | 0 |
| 0.9236111111111112 | 0 |
| 0.9243055555555556 | 0 |
| 0.9249999999999999 | 0 |
| 0.9256944444444444 | 0 |
| 0.9263888888888889 | 0 |
| 0.9270833333333334 | 0 |
| 0.9277777777777777 | 0 |
| 0.9284722222222223 | 0 |
| 0.9291666666666667 | 0 |
| 0.9298611111111111 | 0 |
| 0.9305555555555555 | 0 |
| 0.93125 | 0 |
| 0.9319444444444445 | 0 |
| 0.9326388888888889 | 0 |
| 0.9333333333333332 | 0 |
| 0.9340277777777778 | 0 |
| 0.9347222222222222 | 0 |
| 0.9354166666666667 | 0 |
| 0.936111111111111 | 0 |
| 0.9368055555555556 | 0 |
| 0.9375 | 0 |
| 0.9381944444444444 | 0 |
| 0.938888888888889 | 0 |
| 0.9395833333333333 | 0 |
| 0.9402777777777778 | 0 |
| 0.9409722222222222 | 0 |
| 0.9416666666666668 | 0 |
| 0.9423611111111111 | 0 |
| 0.9430555555555555 | 0 |
| 0.94375 | 0 |
| 0.9444444444444445 | 0 |
| 0.9451388888888889 | 0 |
| 0.9458333333333333 | 0 |
| 0.9465277777777777 | 0 |
| 0.9472222222222223 | 0 |
| 0.9479166666666666 | 0 |
| 0.9486111111111111 | 0 |
| 0.9493055555555556 | 0 |
| 0.9500000000000001 | 0 |
| 0.9506944444444444 | 0 |
| 0.9513888888888888 | 0 |
| 0.9520833333333334 | 0 |
| 0.9527777777777778 | 0 |
| 0.9534722222222222 | 0 |
| 0.9541666666666666 | 0 |
| 0.9548611111111112 | 0 |
| 0.9555555555555556 | 0 |
| 0.9562499999999999 | 0 |
| 0.9569444444444444 | 0 |
| 0.9576388888888889 | 0 |
| 0.9583333333333334 | 0 |
| 0.9590277777777777 | 0 |
| 0.9597222222222223 | 0 |
| 0.9604166666666667 | 0 |
| 0.9611111111111111 | 0 |
| 0.9618055555555555 | 0 |
| 0.9625 | 0 |
| 0.9631944444444445 | 0 |
| 0.9638888888888889 | 0 |
| 0.9645833333333332 | 0 |
| 0.9652777777777778 | 0 |
| 0.9659722222222222 | 0 |
| 0.9666666666666667 | 0 |
| 0.967361111111111 | 0 |
| 0.9680555555555556 | 0 |
| 0.96875 | 0 |
| 0.9694444444444444 | 0 |
| 0.970138888888889 | 0 |
| 0.9708333333333333 | 0 |
| 0.9715277777777778 | 0 |
| 0.9722222222222222 | 0 |
| 0.9729166666666668 | 0 |
| 0.9736111111111111 | 0 |
| 0.9743055555555555 | 0 |
| 0.975 | 0 |
| 0.9756944444444445 | 0 |
| 0.9763888888888889 | 0 |
| 0.9770833333333333 | 0 |
| 0.9777777777777777 | 0 |
| 0.9784722222222223 | 0 |
| 0.9791666666666666 | 0 |
| 0.9798611111111111 | 0 |
| 0.9805555555555556 | 0 |
| 0.9812500000000001 | 0 |
| 0.9819444444444444 | 0 |
| 0.9826388888888888 | 0 |
| 0.9833333333333334 | 0 |
| 0.9840277777777778 | 0 |
| 0.9847222222222222 | 0 |
| 0.9854166666666666 | 0 |
| 0.9861111111111112 | 0 |
| 0.9868055555555556 | 0 |
| 0.9874999999999999 | 0 |
| 0.9881944444444444 | 0 |
| 0.9888888888888889 | 0 |
| 0.9895833333333334 | 0 |
| 0.9902777777777777 | 0 |
| 0.9909722222222223 | 0 |
| 0.9916666666666667 | 0 |
| 0.9923611111111111 | 0 |
| 0.9930555555555555 | 0 |
| 0.99375 | 0 |
| 0.9944444444444445 | 0 |
| 0.9951388888888889 | 0 |
| 0.9958333333333332 | 0 |
| 0.9965277777777778 | 0 |
| 0.9972222222222222 | 0 |
| 0.9979166666666667 | 0 |
| 0.998611111111111 | 0 |
| 0.9993055555555556 | 0 |